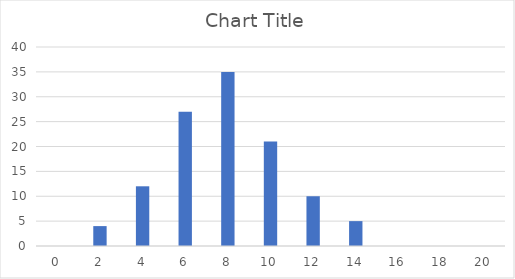
| Category | Series 0 |
|---|---|
| 0.0 | 0 |
| 2.0 | 4 |
| 4.0 | 12 |
| 6.0 | 27 |
| 8.0 | 35 |
| 10.0 | 21 |
| 12.0 | 10 |
| 14.0 | 5 |
| 16.0 | 0 |
| 18.0 | 0 |
| 20.0 | 0 |